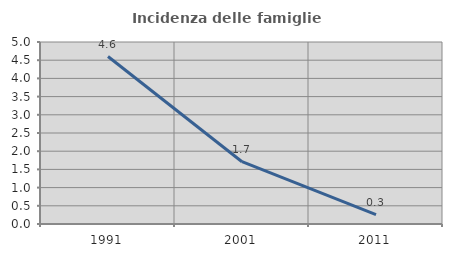
| Category | Incidenza delle famiglie numerose |
|---|---|
| 1991.0 | 4.6 |
| 2001.0 | 1.711 |
| 2011.0 | 0.258 |